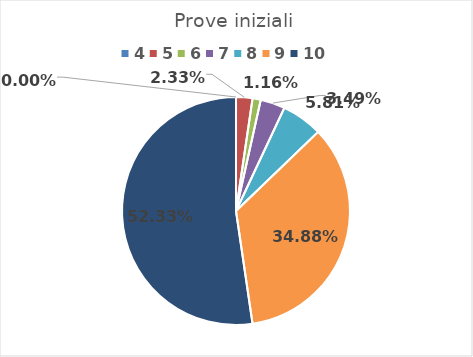
| Category | Series 0 |
|---|---|
| 4.0 | 0 |
| 5.0 | 0.023 |
| 6.0 | 0.012 |
| 7.0 | 0.035 |
| 8.0 | 0.058 |
| 9.0 | 0.349 |
| 10.0 | 0.523 |